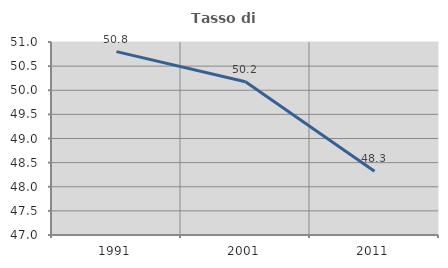
| Category | Tasso di occupazione   |
|---|---|
| 1991.0 | 50.8 |
| 2001.0 | 50.178 |
| 2011.0 | 48.321 |